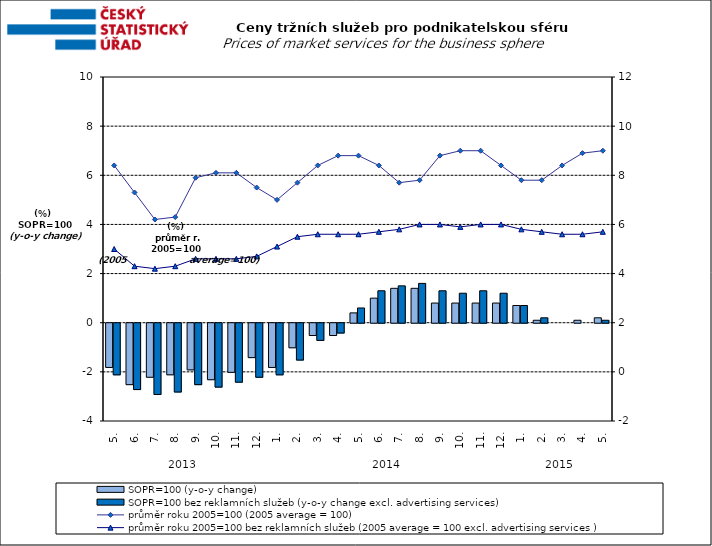
| Category | SOPR=100 (y-o-y change)   | SOPR=100 bez reklamních služeb (y-o-y change excl. advertising services)   |
|---|---|---|
| 0 | -1.8 | -2.1 |
| 1 | -2.5 | -2.7 |
| 2 | -2.2 | -2.9 |
| 3 | -2.1 | -2.8 |
| 4 | -1.9 | -2.5 |
| 5 | -2.3 | -2.6 |
| 6 | -2 | -2.4 |
| 7 | -1.4 | -2.2 |
| 8 | -1.8 | -2.1 |
| 9 | -1 | -1.5 |
| 10 | -0.5 | -0.7 |
| 11 | -0.5 | -0.4 |
| 12 | 0.4 | 0.6 |
| 13 | 1 | 1.3 |
| 14 | 1.4 | 1.5 |
| 15 | 1.4 | 1.6 |
| 16 | 0.8 | 1.3 |
| 17 | 0.8 | 1.2 |
| 18 | 0.8 | 1.3 |
| 19 | 0.8 | 1.2 |
| 20 | 0.7 | 0.7 |
| 21 | 0.1 | 0.2 |
| 22 | 0 | 0 |
| 23 | 0.1 | 0 |
| 24 | 0.2 | 0.1 |